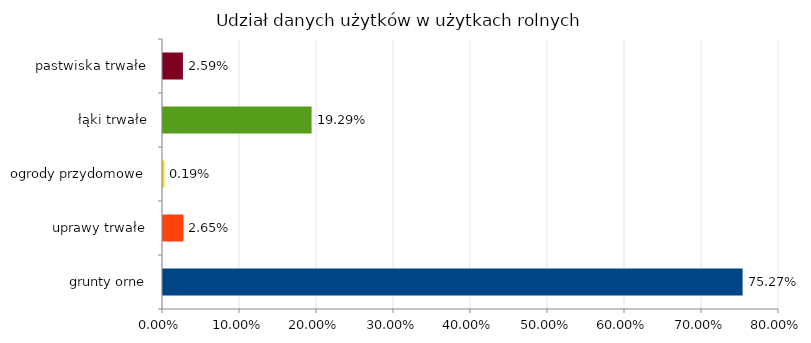
| Category | Series 0 |
|---|---|
| grunty orne | 0.753 |
| uprawy trwałe | 0.027 |
| ogrody przydomowe | 0.002 |
| łąki trwałe | 0.193 |
| pastwiska trwałe | 0.026 |